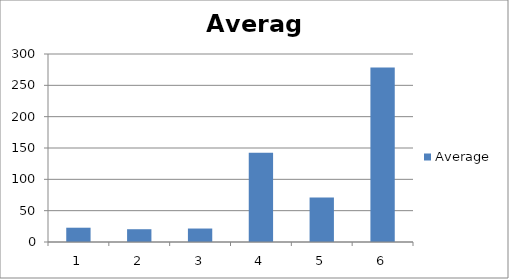
| Category | Average |
|---|---|
| 0 | 22.8 |
| 1 | 20.4 |
| 2 | 21.5 |
| 3 | 142.5 |
| 4 | 71 |
| 5 | 278.364 |